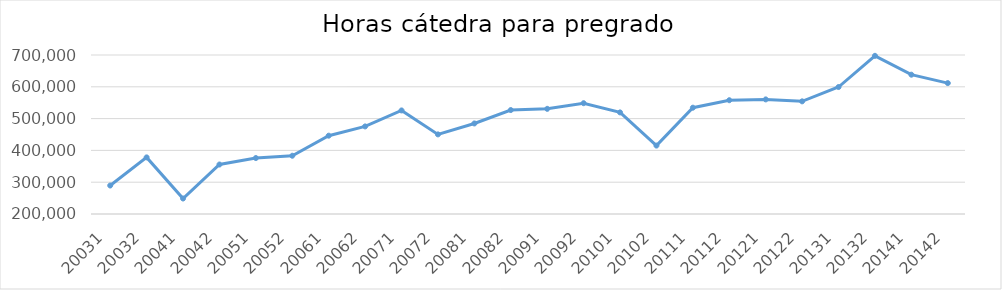
| Category | Horas |
|---|---|
| 20031 | 289559 |
| 20032 | 378019 |
| 20041 | 248740 |
| 20042 | 355610 |
| 20051 | 375988 |
| 20052 | 383225 |
| 20061 | 446277 |
| 20062 | 475399 |
| 20071 | 525673 |
| 20072 | 450344 |
| 20081 | 484730 |
| 20082 | 526867 |
| 20091 | 530699 |
| 20092 | 548433 |
| 20101 | 519456 |
| 20102 | 415183 |
| 20111 | 534306 |
| 20112 | 557820 |
| 20121 | 560358 |
| 20122 | 554266 |
| 20131 | 599313 |
| 20132 | 697397 |
| 20141 | 638107 |
| 20142 | 611632 |